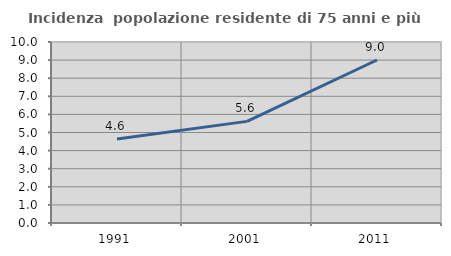
| Category | Incidenza  popolazione residente di 75 anni e più |
|---|---|
| 1991.0 | 4.638 |
| 2001.0 | 5.614 |
| 2011.0 | 9.005 |